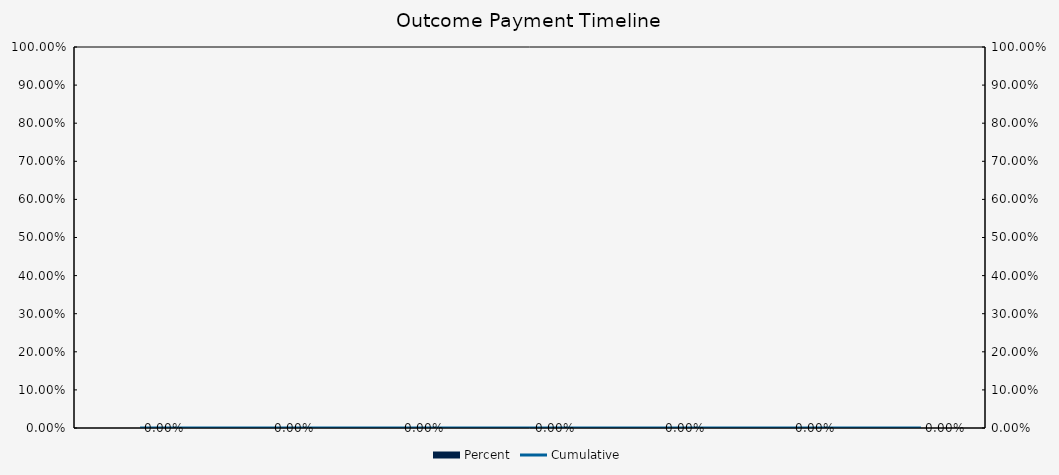
| Category | Percent |
|---|---|
|  | 0 |
|  | 0 |
|  | 0 |
|  | 0 |
|  | 0 |
|  | 0 |
|  | 0 |